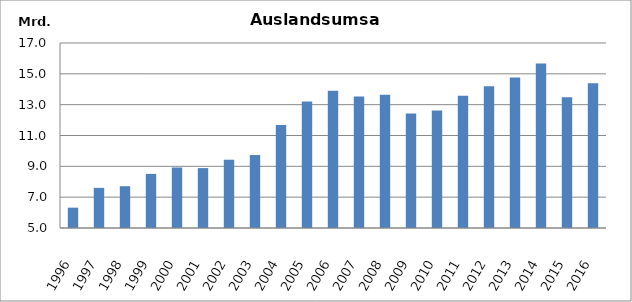
| Category | darunter
Auslandsumsatz |
|---|---|
| 1996.0 | 6319142 |
| 1997.0 | 7603819 |
| 1998.0 | 7711587 |
| 1999.0 | 8508603 |
| 2000.0 | 8925754 |
| 2001.0 | 8885463 |
| 2002.0 | 9428713 |
| 2003.0 | 9733339 |
| 2004.0 | 11680546 |
| 2005.0 | 13208153 |
| 2006.0 | 13901521 |
| 2007.0 | 13537187 |
| 2008.0 | 13649884 |
| 2009.0 | 12432618 |
| 2010.0 | 12628416.402 |
| 2011.0 | 13577795 |
| 2012.0 | 14199097.02 |
| 2013.0 | 14765099.402 |
| 2014.0 | 15677925.464 |
| 2015.0 | 13486756 |
| 2016.0 | 14385658 |